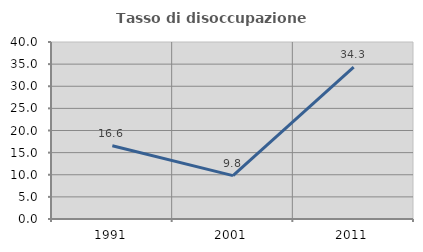
| Category | Tasso di disoccupazione giovanile  |
|---|---|
| 1991.0 | 16.556 |
| 2001.0 | 9.804 |
| 2011.0 | 34.343 |